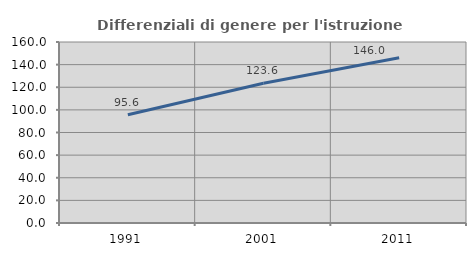
| Category | Differenziali di genere per l'istruzione superiore |
|---|---|
| 1991.0 | 95.643 |
| 2001.0 | 123.57 |
| 2011.0 | 146 |